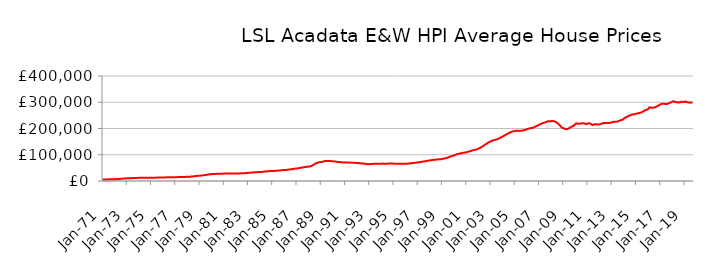
| Category | Series 0 |
|---|---|
| 1971-01-01 | 5724.052 |
| 1971-02-01 | 5764.727 |
| 1971-03-01 | 5805.744 |
| 1971-04-01 | 5859.071 |
| 1971-05-01 | 5947.568 |
| 1971-06-01 | 6039.787 |
| 1971-07-01 | 6153.189 |
| 1971-08-01 | 6276.583 |
| 1971-09-01 | 6398.993 |
| 1971-10-01 | 6526.163 |
| 1971-11-01 | 6663.446 |
| 1971-12-01 | 6830.612 |
| 1972-01-01 | 6946.64 |
| 1972-02-01 | 7022.605 |
| 1972-03-01 | 7195.52 |
| 1972-04-01 | 7437.32 |
| 1972-05-01 | 7786.685 |
| 1972-06-01 | 8093.256 |
| 1972-07-01 | 8445.732 |
| 1972-08-01 | 8785.754 |
| 1972-09-01 | 9085.99 |
| 1972-10-01 | 9366.58 |
| 1972-11-01 | 9626.405 |
| 1972-12-01 | 9894.445 |
| 1973-01-01 | 10086.196 |
| 1973-02-01 | 10221.683 |
| 1973-03-01 | 10377.44 |
| 1973-04-01 | 10555.106 |
| 1973-05-01 | 10782.895 |
| 1973-06-01 | 10930.891 |
| 1973-07-01 | 11085.888 |
| 1973-08-01 | 11257.829 |
| 1973-09-01 | 11458.488 |
| 1973-10-01 | 11666.531 |
| 1973-11-01 | 11825.075 |
| 1973-12-01 | 11938.765 |
| 1974-01-01 | 11999.742 |
| 1974-02-01 | 12065.461 |
| 1974-03-01 | 12062.768 |
| 1974-04-01 | 12036.729 |
| 1974-05-01 | 12013.752 |
| 1974-06-01 | 12014.589 |
| 1974-07-01 | 12026.272 |
| 1974-08-01 | 12065.491 |
| 1974-09-01 | 12136.837 |
| 1974-10-01 | 12224.473 |
| 1974-11-01 | 12297.099 |
| 1974-12-01 | 12368.8 |
| 1975-01-01 | 12401.972 |
| 1975-02-01 | 12443.817 |
| 1975-03-01 | 12518.081 |
| 1975-04-01 | 12623.827 |
| 1975-05-01 | 12752.207 |
| 1975-06-01 | 12820.938 |
| 1975-07-01 | 12888.334 |
| 1975-08-01 | 12981.389 |
| 1975-09-01 | 13107.324 |
| 1975-10-01 | 13247.24 |
| 1975-11-01 | 13370.433 |
| 1975-12-01 | 13502.183 |
| 1976-01-01 | 13594.945 |
| 1976-02-01 | 13682.301 |
| 1976-03-01 | 13742.074 |
| 1976-04-01 | 13805.651 |
| 1976-05-01 | 13888.833 |
| 1976-06-01 | 13943.255 |
| 1976-07-01 | 14003.455 |
| 1976-08-01 | 14092.549 |
| 1976-09-01 | 14220.052 |
| 1976-10-01 | 14363.748 |
| 1976-11-01 | 14478.728 |
| 1976-12-01 | 14581.408 |
| 1977-01-01 | 14638.5 |
| 1977-02-01 | 14704.068 |
| 1977-03-01 | 14746.584 |
| 1977-04-01 | 14796.452 |
| 1977-05-01 | 14873.475 |
| 1977-06-01 | 14943.32 |
| 1977-07-01 | 15029.197 |
| 1977-08-01 | 15146.978 |
| 1977-09-01 | 15291.017 |
| 1977-10-01 | 15453.279 |
| 1977-11-01 | 15624.938 |
| 1977-12-01 | 15849 |
| 1978-01-01 | 16015.39 |
| 1978-02-01 | 16145.255 |
| 1978-03-01 | 16320.261 |
| 1978-04-01 | 16555.686 |
| 1978-05-01 | 16933.102 |
| 1978-06-01 | 17315.025 |
| 1978-07-01 | 17776.942 |
| 1978-08-01 | 18250.744 |
| 1978-09-01 | 18706.734 |
| 1978-10-01 | 19160.153 |
| 1978-11-01 | 19582.961 |
| 1978-12-01 | 20000.721 |
| 1979-01-01 | 20249.228 |
| 1979-02-01 | 20415.907 |
| 1979-03-01 | 20831.095 |
| 1979-04-01 | 21400.214 |
| 1979-05-01 | 22126.495 |
| 1979-06-01 | 22587.387 |
| 1979-07-01 | 23065.762 |
| 1979-08-01 | 23604.455 |
| 1979-09-01 | 24249.836 |
| 1979-10-01 | 24938.747 |
| 1979-11-01 | 25512.34 |
| 1979-12-01 | 25958.028 |
| 1980-01-01 | 26202.72 |
| 1980-02-01 | 26392.91 |
| 1980-03-01 | 26636.942 |
| 1980-04-01 | 26922.685 |
| 1980-05-01 | 27256.94 |
| 1980-06-01 | 27435.742 |
| 1980-07-01 | 27597.878 |
| 1980-08-01 | 27747.714 |
| 1980-09-01 | 27853.364 |
| 1980-10-01 | 27921.018 |
| 1980-11-01 | 27973.017 |
| 1980-12-01 | 28083.641 |
| 1981-01-01 | 28149.402 |
| 1981-02-01 | 28249.159 |
| 1981-03-01 | 28349.185 |
| 1981-04-01 | 28483.438 |
| 1981-05-01 | 28619.554 |
| 1981-06-01 | 28665.734 |
| 1981-07-01 | 28687.757 |
| 1981-08-01 | 28693.199 |
| 1981-09-01 | 28639.156 |
| 1981-10-01 | 28540.531 |
| 1981-11-01 | 28449.988 |
| 1981-12-01 | 28440.131 |
| 1982-01-01 | 28396.186 |
| 1982-02-01 | 28415.433 |
| 1982-03-01 | 28573.016 |
| 1982-04-01 | 28838.513 |
| 1982-05-01 | 29135.915 |
| 1982-06-01 | 29244.445 |
| 1982-07-01 | 29326.329 |
| 1982-08-01 | 29482.476 |
| 1982-09-01 | 29735.669 |
| 1982-10-01 | 30036.483 |
| 1982-11-01 | 30336.175 |
| 1982-12-01 | 30707.835 |
| 1983-01-01 | 30990.247 |
| 1983-02-01 | 31232.959 |
| 1983-03-01 | 31485.859 |
| 1983-04-01 | 31799.274 |
| 1983-05-01 | 32210.334 |
| 1983-06-01 | 32532.911 |
| 1983-07-01 | 32884.142 |
| 1983-08-01 | 33217.828 |
| 1983-09-01 | 33484.567 |
| 1983-10-01 | 33702.791 |
| 1983-11-01 | 33908.719 |
| 1983-12-01 | 34179.18 |
| 1984-01-01 | 34340.828 |
| 1984-02-01 | 34504.946 |
| 1984-03-01 | 34816.545 |
| 1984-04-01 | 35248.792 |
| 1984-05-01 | 35743.59 |
| 1984-06-01 | 35962.963 |
| 1984-07-01 | 36146.557 |
| 1984-08-01 | 36426.283 |
| 1984-09-01 | 36872.65 |
| 1984-10-01 | 37389.081 |
| 1984-11-01 | 37788.221 |
| 1984-12-01 | 38065.626 |
| 1985-01-01 | 38142.632 |
| 1985-02-01 | 38249.055 |
| 1985-03-01 | 38510.694 |
| 1985-04-01 | 38878.195 |
| 1985-05-01 | 39297.821 |
| 1985-06-01 | 39459.982 |
| 1985-07-01 | 39609.899 |
| 1985-08-01 | 39869.781 |
| 1985-09-01 | 40303.194 |
| 1985-10-01 | 40798.184 |
| 1985-11-01 | 41214.216 |
| 1985-12-01 | 41546.956 |
| 1986-01-01 | 41676.289 |
| 1986-02-01 | 41808.343 |
| 1986-03-01 | 42194.079 |
| 1986-04-01 | 42752.059 |
| 1986-05-01 | 43448.482 |
| 1986-06-01 | 43870.111 |
| 1986-07-01 | 44301.132 |
| 1986-08-01 | 44815.67 |
| 1986-09-01 | 45462.382 |
| 1986-10-01 | 46160.79 |
| 1986-11-01 | 46794.738 |
| 1986-12-01 | 47385.809 |
| 1987-01-01 | 47728.735 |
| 1987-02-01 | 48012.679 |
| 1987-03-01 | 48628.588 |
| 1987-04-01 | 49457.847 |
| 1987-05-01 | 50448.678 |
| 1987-06-01 | 51007.765 |
| 1987-07-01 | 51542.618 |
| 1987-08-01 | 52131.235 |
| 1987-09-01 | 52770.168 |
| 1987-10-01 | 53431.581 |
| 1987-11-01 | 54051.264 |
| 1987-12-01 | 54693.136 |
| 1988-01-01 | 54998.269 |
| 1988-02-01 | 55261.433 |
| 1988-03-01 | 56181.853 |
| 1988-04-01 | 57567.018 |
| 1988-05-01 | 59651.186 |
| 1988-06-01 | 61754.283 |
| 1988-07-01 | 64230.632 |
| 1988-08-01 | 66508.571 |
| 1988-09-01 | 68262.579 |
| 1988-10-01 | 69718.912 |
| 1988-11-01 | 70890.185 |
| 1988-12-01 | 71930.099 |
| 1989-01-01 | 72473.695 |
| 1989-02-01 | 72933.253 |
| 1989-03-01 | 73713.269 |
| 1989-04-01 | 74706.375 |
| 1989-05-01 | 75758.491 |
| 1989-06-01 | 76218.182 |
| 1989-07-01 | 76531.16 |
| 1989-08-01 | 76677.894 |
| 1989-09-01 | 76551.393 |
| 1989-10-01 | 76197.409 |
| 1989-11-01 | 75726.489 |
| 1989-12-01 | 75342.662 |
| 1990-01-01 | 74997.209 |
| 1990-02-01 | 74983.033 |
| 1990-03-01 | 74468.301 |
| 1990-04-01 | 73800.231 |
| 1990-05-01 | 73019.079 |
| 1990-06-01 | 72646.325 |
| 1990-07-01 | 72328.69 |
| 1990-08-01 | 72019.086 |
| 1990-09-01 | 71584.02 |
| 1990-10-01 | 71086.736 |
| 1990-11-01 | 70625.213 |
| 1990-12-01 | 70429.161 |
| 1991-01-01 | 70291.343 |
| 1991-02-01 | 70365.195 |
| 1991-03-01 | 70253.325 |
| 1991-04-01 | 70179.426 |
| 1991-05-01 | 70082.158 |
| 1991-06-01 | 70038.63 |
| 1991-07-01 | 69992.377 |
| 1991-08-01 | 69927.492 |
| 1991-09-01 | 69816.431 |
| 1991-10-01 | 69617.764 |
| 1991-11-01 | 69292.362 |
| 1991-12-01 | 68948.205 |
| 1992-01-01 | 68607.347 |
| 1992-02-01 | 68555.077 |
| 1992-03-01 | 68076.952 |
| 1992-04-01 | 67499.842 |
| 1992-05-01 | 66862.788 |
| 1992-06-01 | 66654.255 |
| 1992-07-01 | 66504.32 |
| 1992-08-01 | 66189.656 |
| 1992-09-01 | 65518.05 |
| 1992-10-01 | 64684.723 |
| 1992-11-01 | 64119.825 |
| 1992-12-01 | 64136.269 |
| 1993-01-01 | 64294.945 |
| 1993-02-01 | 64575.741 |
| 1993-03-01 | 64828.051 |
| 1993-04-01 | 65143.693 |
| 1993-05-01 | 65412.799 |
| 1993-06-01 | 65443.582 |
| 1993-07-01 | 65463.054 |
| 1993-08-01 | 65516.954 |
| 1993-09-01 | 65475.951 |
| 1993-10-01 | 65357.973 |
| 1993-11-01 | 65280.77 |
| 1993-12-01 | 65509.301 |
| 1994-01-01 | 65823.679 |
| 1994-02-01 | 66215.591 |
| 1994-03-01 | 66200.652 |
| 1994-04-01 | 66040.858 |
| 1994-05-01 | 65900.526 |
| 1994-06-01 | 65913.104 |
| 1994-07-01 | 65992.304 |
| 1994-08-01 | 66155.2 |
| 1994-09-01 | 66414.12 |
| 1994-10-01 | 66727.801 |
| 1994-11-01 | 66876.257 |
| 1994-12-01 | 66788.676 |
| 1995-01-01 | 66299.285 |
| 1995-02-01 | 65878.008 |
| 1995-03-01 | 65719.605 |
| 1995-04-01 | 65554.552 |
| 1995-05-01 | 65582.512 |
| 1995-06-01 | 65443.379 |
| 1995-07-01 | 65586.036 |
| 1995-08-01 | 65649.397 |
| 1995-09-01 | 65686.864 |
| 1995-10-01 | 65663.319 |
| 1995-11-01 | 65746.116 |
| 1995-12-01 | 65826.774 |
| 1996-01-01 | 65850.653 |
| 1996-02-01 | 65810.587 |
| 1996-03-01 | 66028.038 |
| 1996-04-01 | 66284.657 |
| 1996-05-01 | 66772.208 |
| 1996-06-01 | 67129.112 |
| 1996-07-01 | 67711.942 |
| 1996-08-01 | 68275.864 |
| 1996-09-01 | 68845.613 |
| 1996-10-01 | 69260.464 |
| 1996-11-01 | 69700.306 |
| 1996-12-01 | 70322.263 |
| 1997-01-01 | 70768.381 |
| 1997-02-01 | 71243.642 |
| 1997-03-01 | 71649.555 |
| 1997-04-01 | 72308.33 |
| 1997-05-01 | 73168.819 |
| 1997-06-01 | 73822.225 |
| 1997-07-01 | 74283.52 |
| 1997-08-01 | 75018.824 |
| 1997-09-01 | 75676.696 |
| 1997-10-01 | 76528.781 |
| 1997-11-01 | 77124.603 |
| 1997-12-01 | 77881.3 |
| 1998-01-01 | 78330.231 |
| 1998-02-01 | 79004.394 |
| 1998-03-01 | 79592.47 |
| 1998-04-01 | 80322.56 |
| 1998-05-01 | 80841.191 |
| 1998-06-01 | 81159.809 |
| 1998-07-01 | 81541.341 |
| 1998-08-01 | 81898.34 |
| 1998-09-01 | 82259.693 |
| 1998-10-01 | 82499.46 |
| 1998-11-01 | 82779.197 |
| 1998-12-01 | 83115.498 |
| 1999-01-01 | 83613.265 |
| 1999-02-01 | 84607.397 |
| 1999-03-01 | 85483.743 |
| 1999-04-01 | 86353.108 |
| 1999-05-01 | 87305.138 |
| 1999-06-01 | 88312.28 |
| 1999-07-01 | 89497.981 |
| 1999-08-01 | 91032.635 |
| 1999-09-01 | 92597.032 |
| 1999-10-01 | 94034.378 |
| 1999-11-01 | 95010.364 |
| 1999-12-01 | 96321.288 |
| 2000-01-01 | 97366.774 |
| 2000-02-01 | 99251.532 |
| 2000-03-01 | 100730.988 |
| 2000-04-01 | 102308.236 |
| 2000-05-01 | 103106.757 |
| 2000-06-01 | 104085.675 |
| 2000-07-01 | 104959.016 |
| 2000-08-01 | 105772.797 |
| 2000-09-01 | 106528.421 |
| 2000-10-01 | 107304.612 |
| 2000-11-01 | 107943.909 |
| 2000-12-01 | 108757.874 |
| 2001-01-01 | 109417.271 |
| 2001-02-01 | 110440.317 |
| 2001-03-01 | 111397.347 |
| 2001-04-01 | 112573.02 |
| 2001-05-01 | 113841.339 |
| 2001-06-01 | 114892.733 |
| 2001-07-01 | 116039.556 |
| 2001-08-01 | 117182.64 |
| 2001-09-01 | 118217.849 |
| 2001-10-01 | 118912.764 |
| 2001-11-01 | 120098.452 |
| 2001-12-01 | 121411.939 |
| 2002-01-01 | 123166.767 |
| 2002-02-01 | 124871.682 |
| 2002-03-01 | 126908.869 |
| 2002-04-01 | 129102.371 |
| 2002-05-01 | 131578.986 |
| 2002-06-01 | 134087.286 |
| 2002-07-01 | 136833.825 |
| 2002-08-01 | 139273.788 |
| 2002-09-01 | 141863.407 |
| 2002-10-01 | 144288.693 |
| 2002-11-01 | 146419.218 |
| 2002-12-01 | 148765.121 |
| 2003-01-01 | 150857.648 |
| 2003-02-01 | 152575.228 |
| 2003-03-01 | 153963.556 |
| 2003-04-01 | 155291.778 |
| 2003-05-01 | 156419.19 |
| 2003-06-01 | 157325.604 |
| 2003-07-01 | 158124.52 |
| 2003-08-01 | 159695.266 |
| 2003-09-01 | 161335.594 |
| 2003-10-01 | 163479.587 |
| 2003-11-01 | 165561.004 |
| 2003-12-01 | 167304.174 |
| 2004-01-01 | 169237.373 |
| 2004-02-01 | 171569.665 |
| 2004-03-01 | 173826.226 |
| 2004-04-01 | 175870.599 |
| 2004-05-01 | 178091.302 |
| 2004-06-01 | 180200.731 |
| 2004-07-01 | 182234.825 |
| 2004-08-01 | 184303.51 |
| 2004-09-01 | 185935.388 |
| 2004-10-01 | 187601.536 |
| 2004-11-01 | 188503.108 |
| 2004-12-01 | 189492.009 |
| 2005-01-01 | 190271.849 |
| 2005-02-01 | 191414.961 |
| 2005-03-01 | 191307.384 |
| 2005-04-01 | 191385.931 |
| 2005-05-01 | 190789.147 |
| 2005-06-01 | 191309.844 |
| 2005-07-01 | 191319.555 |
| 2005-08-01 | 191569.071 |
| 2005-09-01 | 192146.589 |
| 2005-10-01 | 193274.487 |
| 2005-11-01 | 194204.629 |
| 2005-12-01 | 195787.179 |
| 2006-01-01 | 196789.447 |
| 2006-02-01 | 198441.023 |
| 2006-03-01 | 199612.645 |
| 2006-04-01 | 200830.649 |
| 2006-05-01 | 201614.139 |
| 2006-06-01 | 202207.347 |
| 2006-07-01 | 203075.969 |
| 2006-08-01 | 204234.21 |
| 2006-09-01 | 205945.735 |
| 2006-10-01 | 207990.011 |
| 2006-11-01 | 209617.09 |
| 2006-12-01 | 211765.837 |
| 2007-01-01 | 213538.029 |
| 2007-02-01 | 216107.841 |
| 2007-03-01 | 217479.29 |
| 2007-04-01 | 219272.042 |
| 2007-05-01 | 220315.078 |
| 2007-06-01 | 222009.115 |
| 2007-07-01 | 222687.123 |
| 2007-08-01 | 224460.722 |
| 2007-09-01 | 226227.808 |
| 2007-10-01 | 227540.609 |
| 2007-11-01 | 227284.839 |
| 2007-12-01 | 227433.413 |
| 2008-01-01 | 227827.129 |
| 2008-02-01 | 228741.432 |
| 2008-03-01 | 228118.902 |
| 2008-04-01 | 227674.481 |
| 2008-05-01 | 226200.506 |
| 2008-06-01 | 224434.589 |
| 2008-07-01 | 221197.984 |
| 2008-08-01 | 218181.885 |
| 2008-09-01 | 214541.399 |
| 2008-10-01 | 210634.505 |
| 2008-11-01 | 206130.652 |
| 2008-12-01 | 202930.031 |
| 2009-01-01 | 201447.291 |
| 2009-02-01 | 200195.627 |
| 2009-03-01 | 198543.307 |
| 2009-04-01 | 197695.062 |
| 2009-05-01 | 198115.164 |
| 2009-06-01 | 199629.16 |
| 2009-07-01 | 201223.033 |
| 2009-08-01 | 203501.941 |
| 2009-09-01 | 206187.319 |
| 2009-10-01 | 208584.386 |
| 2009-11-01 | 209002.713 |
| 2009-12-01 | 213111.81 |
| 2010-01-01 | 216322.861 |
| 2010-02-01 | 219924.872 |
| 2010-03-01 | 218537.513 |
| 2010-04-01 | 217809.916 |
| 2010-05-01 | 217968.902 |
| 2010-06-01 | 218732.691 |
| 2010-07-01 | 219353.324 |
| 2010-08-01 | 220110.662 |
| 2010-09-01 | 220078.897 |
| 2010-10-01 | 219216.311 |
| 2010-11-01 | 217612.082 |
| 2010-12-01 | 217601.628 |
| 2011-01-01 | 218123.147 |
| 2011-02-01 | 219783.244 |
| 2011-03-01 | 219987.92 |
| 2011-04-01 | 217896.56 |
| 2011-05-01 | 215070.552 |
| 2011-06-01 | 213541.473 |
| 2011-07-01 | 214581.343 |
| 2011-08-01 | 216103.808 |
| 2011-09-01 | 216078.388 |
| 2011-10-01 | 216350.889 |
| 2011-11-01 | 215125.515 |
| 2011-12-01 | 215194.364 |
| 2012-01-01 | 215889.202 |
| 2012-02-01 | 216649.949 |
| 2012-03-01 | 218490.049 |
| 2012-04-01 | 219309.105 |
| 2012-05-01 | 221366.338 |
| 2012-06-01 | 221374.859 |
| 2012-07-01 | 221152.402 |
| 2012-08-01 | 220672.565 |
| 2012-09-01 | 220892.388 |
| 2012-10-01 | 221300.28 |
| 2012-11-01 | 221404.715 |
| 2012-12-01 | 222092.485 |
| 2013-01-01 | 222828.062 |
| 2013-02-01 | 224736.007 |
| 2013-03-01 | 225563.602 |
| 2013-04-01 | 226164.103 |
| 2013-05-01 | 225918.187 |
| 2013-06-01 | 226228.04 |
| 2013-07-01 | 227080.324 |
| 2013-08-01 | 228563.69 |
| 2013-09-01 | 230019.564 |
| 2013-10-01 | 231440.016 |
| 2013-11-01 | 232463.672 |
| 2013-12-01 | 234563.62 |
| 2014-01-01 | 237782.418 |
| 2014-02-01 | 240132.395 |
| 2014-03-01 | 242575.432 |
| 2014-04-01 | 243916.58 |
| 2014-05-01 | 246293.59 |
| 2014-06-01 | 248306.816 |
| 2014-07-01 | 249917.641 |
| 2014-08-01 | 251785.869 |
| 2014-09-01 | 253228.454 |
| 2014-10-01 | 254149.034 |
| 2014-11-01 | 254163.788 |
| 2014-12-01 | 254509.495 |
| 2015-01-01 | 255974.307 |
| 2015-02-01 | 257239.904 |
| 2015-03-01 | 257907.417 |
| 2015-04-01 | 258526.388 |
| 2015-05-01 | 259614.599 |
| 2015-06-01 | 261047.351 |
| 2015-07-01 | 262197.133 |
| 2015-08-01 | 264709.142 |
| 2015-09-01 | 266706.424 |
| 2015-10-01 | 269488.987 |
| 2015-11-01 | 270061.523 |
| 2015-12-01 | 272125.761 |
| 2016-01-01 | 274297.09 |
| 2016-02-01 | 279967.268 |
| 2016-03-01 | 280440.433 |
| 2016-04-01 | 280424.799 |
| 2016-05-01 | 278466.737 |
| 2016-06-01 | 279398.104 |
| 2016-07-01 | 279790.631 |
| 2016-08-01 | 280598.995 |
| 2016-09-01 | 282384.739 |
| 2016-10-01 | 285117.626 |
| 2016-11-01 | 286918.623 |
| 2016-12-01 | 289050.604 |
| 2017-01-01 | 291359.405 |
| 2017-02-01 | 293129.968 |
| 2017-03-01 | 294670.028 |
| 2017-04-01 | 294572.006 |
| 2017-05-01 | 294562.665 |
| 2017-06-01 | 293292.937 |
| 2017-07-01 | 293115.677 |
| 2017-08-01 | 293460.087 |
| 2017-09-01 | 295346.705 |
| 2017-10-01 | 296793.859 |
| 2017-11-01 | 298114.542 |
| 2017-12-01 | 300135.301 |
| 2018-01-01 | 302502.536 |
| 2018-02-01 | 303883.722 |
| 2018-03-01 | 303030.622 |
| 2018-04-01 | 301227.51 |
| 2018-05-01 | 299997.285 |
| 2018-06-01 | 299669.204 |
| 2018-07-01 | 298878.374 |
| 2018-08-01 | 299567.909 |
| 2018-09-01 | 300136.073 |
| 2018-10-01 | 302141.149 |
| 2018-11-01 | 301180.784 |
| 2018-12-01 | 301539.793 |
| 2019-01-01 | 301667.809 |
| 2019-02-01 | 302910.812 |
| 2019-03-01 | 301327.354 |
| 2019-04-01 | 299796.586 |
| 2019-05-01 | 299322.433 |
| 2019-06-01 | 299394.529 |
| 2019-07-01 | 299380.849 |
| 2019-08-01 | 298934.156 |
| 2019-09-01 | 299047.236 |